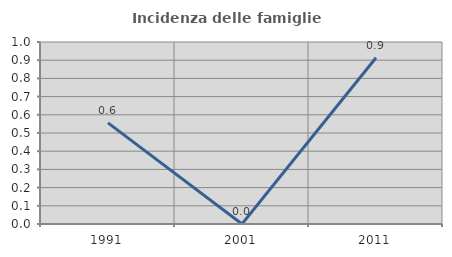
| Category | Incidenza delle famiglie numerose |
|---|---|
| 1991.0 | 0.556 |
| 2001.0 | 0 |
| 2011.0 | 0.913 |